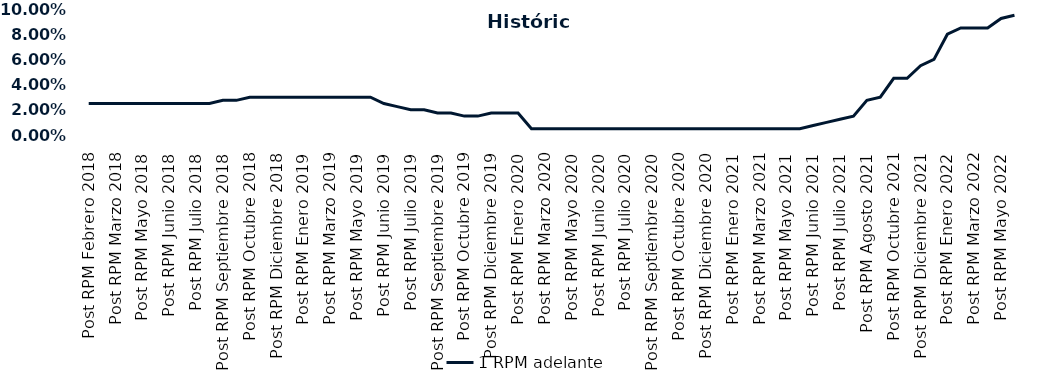
| Category | 1 RPM adelante |
|---|---|
| Post RPM Febrero 2018 | 0.025 |
| Pre RPM Marzo 2018 | 0.025 |
| Post RPM Marzo 2018 | 0.025 |
| Pre RPM Mayo 2018 | 0.025 |
| Post RPM Mayo 2018 | 0.025 |
| Pre RPM Junio 2018 | 0.025 |
| Post RPM Junio 2018 | 0.025 |
| Pre RPM Julio 2018 | 0.025 |
| Post RPM Julio 2018 | 0.025 |
| Pre RPM Septiembre 2018 | 0.025 |
| Post RPM Septiembre 2018 | 0.028 |
| Pre RPM Octubre 2018 | 0.028 |
| Post RPM Octubre 2018 | 0.03 |
| Pre RPM Diciembre 2018 | 0.03 |
| Post RPM Diciembre 2018 | 0.03 |
| Pre RPM Enero 2019 | 0.03 |
| Post RPM Enero 2019 | 0.03 |
| Pre RPM Marzo 2019 | 0.03 |
| Post RPM Marzo 2019 | 0.03 |
| Pre RPM Mayo 2019 | 0.03 |
| Post RPM Mayo 2019 | 0.03 |
| Pre RPM Junio 2019 | 0.03 |
| Post RPM Junio 2019 | 0.025 |
| Pre RPM Julio 2019 | 0.022 |
| Post RPM Julio 2019 | 0.02 |
| Pre RPM Septiembre 2019 | 0.02 |
| Post RPM Septiembre 2019 | 0.018 |
| Pre RPM Octubre 2019 | 0.018 |
| Post RPM Octubre 2019 | 0.015 |
| Pre RPM Diciembre 2019 | 0.015 |
| Post RPM Diciembre 2019 | 0.018 |
| Pre RPM Enero 2020 | 0.018 |
| Post RPM Enero 2020 | 0.018 |
| Pre RPM Marzo 2020 | 0.005 |
| Post RPM Marzo 2020 | 0.005 |
| Pre RPM Mayo 2020 | 0.005 |
| Post RPM Mayo 2020 | 0.005 |
| Pre RPM Junio 2020 | 0.005 |
| Post RPM Junio 2020 | 0.005 |
| Pre RPM Julio 2020 | 0.005 |
| Post RPM Julio 2020 | 0.005 |
| Pre RPM Septiembre 2020 | 0.005 |
| Post RPM Septiembre 2020 | 0.005 |
| Pre RPM Octubre 2020 | 0.005 |
| Post RPM Octubre 2020 | 0.005 |
| Pre RPM Diciembre 2020 | 0.005 |
| Post RPM Diciembre 2020 | 0.005 |
| Pre RPM Enero 2021 | 0.005 |
| Post RPM Enero 2021 | 0.005 |
| Pre RPM Marzo 2021 | 0.005 |
| Post RPM Marzo 2021 | 0.005 |
| Pre RPM Mayo 2021 | 0.005 |
| Post RPM Mayo 2021 | 0.005 |
| Pre RPM Junio 2021 | 0.005 |
| Post RPM Junio 2021 | 0.008 |
| Pre RPM Julio 2021 | 0.01 |
| Post RPM Julio 2021 | 0.012 |
| Pre RPM Agosto 2021 | 0.015 |
| Post RPM Agosto 2021 | 0.028 |
| Pre RPM Octubre 2021 | 0.03 |
| Post RPM Octubre 2021 | 0.045 |
| Pre RPM Diciembre 2021 | 0.045 |
| Post RPM Diciembre 2021 | 0.055 |
| Pre RPM Enero 2022 | 0.06 |
| Post RPM Enero 2022 | 0.08 |
| Pre RPM Marzo 2022 | 0.085 |
| Post RPM Marzo 2022 | 0.085 |
| Pre RPM Mayo 2022 | 0.085 |
| Post RPM Mayo 2022 | 0.092 |
| Pre RPM Junio 2022 | 0.095 |